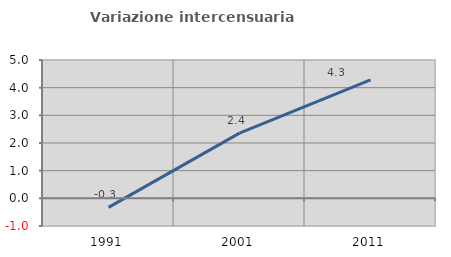
| Category | Variazione intercensuaria annua |
|---|---|
| 1991.0 | -0.327 |
| 2001.0 | 2.357 |
| 2011.0 | 4.283 |